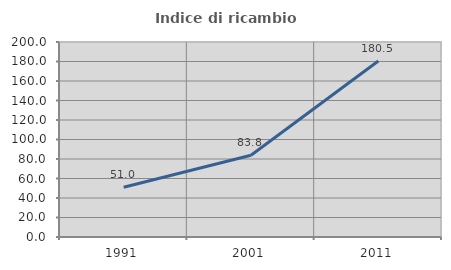
| Category | Indice di ricambio occupazionale  |
|---|---|
| 1991.0 | 50.987 |
| 2001.0 | 83.801 |
| 2011.0 | 180.484 |